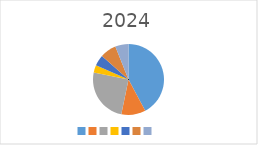
| Category | Series 0 |
|---|---|
|  | 1017160 |
|  | 266349 |
|  | 600000 |
|  | 82800 |
|  | 120000 |
|  | 178387 |
|  | 145600 |